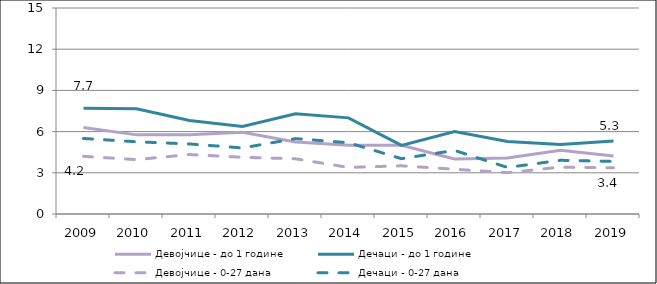
| Category | Девојчице - до 1 године | Дечаци - до 1 године | Девојчице - 0-27 дана | Дечаци - 0-27 дана |
|---|---|---|---|---|
| 2009.0 | 6.3 | 7.7 | 4.2 | 5.5 |
| 2010.0 | 5.762 | 7.661 | 3.96 | 5.26 |
| 2011.0 | 5.779 | 6.808 | 4.33 | 5.1 |
| 2012.0 | 5.959 | 6.371 | 4.13 | 4.81 |
| 2013.0 | 5.244 | 7.298 | 4.02 | 5.49 |
| 2014.0 | 5 | 7 | 3.39 | 5.19 |
| 2015.0 | 5 | 5 | 3.51 | 4.03 |
| 2016.0 | 4 | 6 | 3.26 | 4.63 |
| 2017.0 | 4.086 | 5.282 | 3.01 | 3.39 |
| 2018.0 | 4.648 | 5.059 | 3.41 | 3.91 |
| 2019.0 | 4.222 | 5.311 | 3.36 | 3.83 |